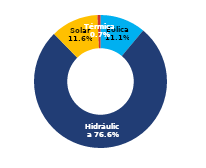
| Category | Sur |
|---|---|
| Eólica | 69.977 |
| Hidráulica | 483.607 |
| Solar | 72.942 |
| Térmica | 4.671 |